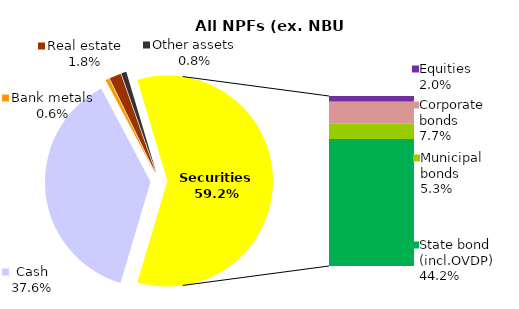
| Category | All NPF (ex. NBU CNPF) |
|---|---|
| Cash | 719.882 |
| Bank metals | 11.037 |
| Real estate | 34.42 |
| Other assets | 14.972 |
| Equities | 38.163 |
| Corporate bonds | 147.117 |
| Municipal bonds | 101.979 |
| State bond (incl.OVDP) | 845.64 |